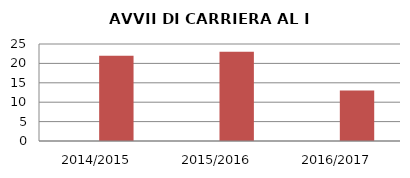
| Category | ANNO | NUMERO |
|---|---|---|
| 2014/2015 | 0 | 22 |
| 2015/2016 | 0 | 23 |
| 2016/2017 | 0 | 13 |